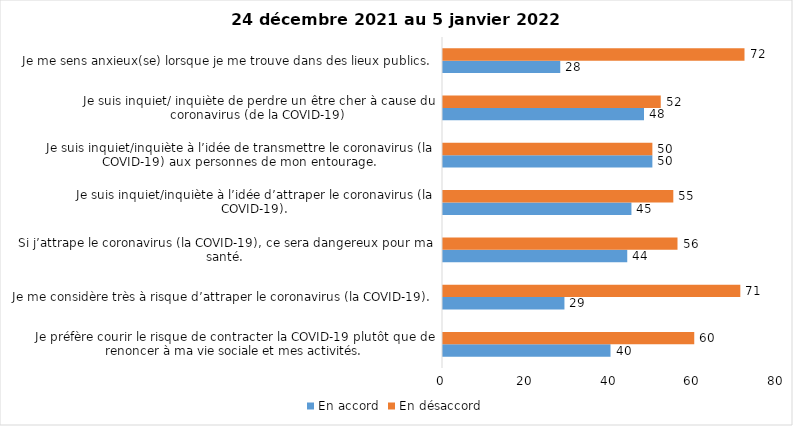
| Category | En accord | En désaccord |
|---|---|---|
| Je préfère courir le risque de contracter la COVID-19 plutôt que de renoncer à ma vie sociale et mes activités. | 40 | 60 |
| Je me considère très à risque d’attraper le coronavirus (la COVID-19). | 29 | 71 |
| Si j’attrape le coronavirus (la COVID-19), ce sera dangereux pour ma santé. | 44 | 56 |
| Je suis inquiet/inquiète à l’idée d’attraper le coronavirus (la COVID-19). | 45 | 55 |
| Je suis inquiet/inquiète à l’idée de transmettre le coronavirus (la COVID-19) aux personnes de mon entourage. | 50 | 50 |
| Je suis inquiet/ inquiète de perdre un être cher à cause du coronavirus (de la COVID-19) | 48 | 52 |
| Je me sens anxieux(se) lorsque je me trouve dans des lieux publics. | 28 | 72 |